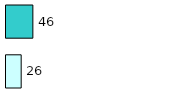
| Category | Series 0 | Series 1 |
|---|---|---|
| 0 | 26 | 46 |